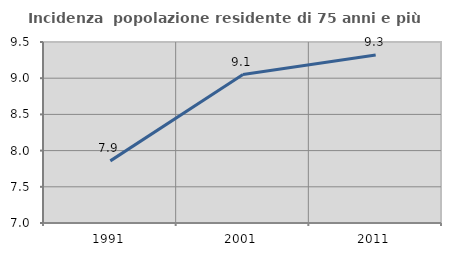
| Category | Incidenza  popolazione residente di 75 anni e più |
|---|---|
| 1991.0 | 7.858 |
| 2001.0 | 9.051 |
| 2011.0 | 9.32 |